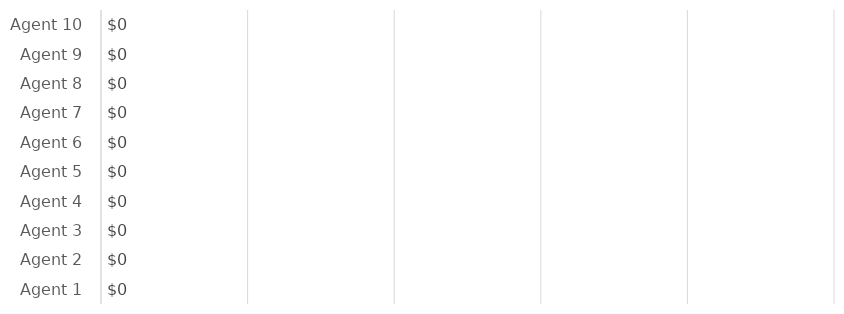
| Category | Series 0 |
|---|---|
| Agent 1 | 0 |
| Agent 2 | 0 |
| Agent 3 | 0 |
| Agent 4 | 0 |
| Agent 5 | 0 |
| Agent 6 | 0 |
| Agent 7 | 0 |
| Agent 8 | 0 |
| Agent 9 | 0 |
| Agent 10 | 0 |